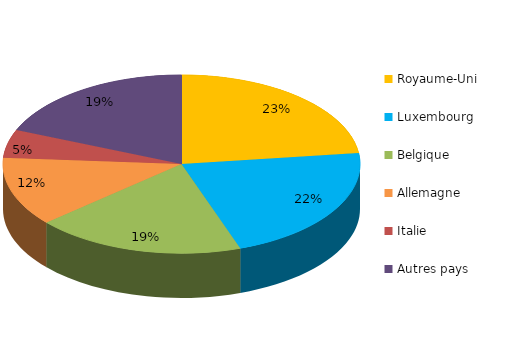
| Category | Series 0 |
|---|---|
| Royaume-Uni | 194519734 |
| Luxembourg | 182727839.78 |
| Belgique | 160165931.44 |
| Allemagne | 105453095.88 |
| Italie | 43484418.45 |
| Autres pays | 158202786.26 |